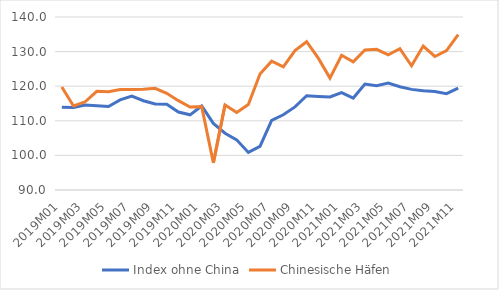
| Category | Index ohne China | Chinesische Häfen |
|---|---|---|
| 2019M01 | 113.937 | 119.767 |
| 2019M02 | 113.812 | 114.273 |
| 2019M03 | 114.535 | 115.492 |
| 2019M04 | 114.346 | 118.515 |
| 2019M05 | 114.139 | 118.384 |
| 2019M06 | 116.043 | 119.064 |
| 2019M07 | 117.144 | 119.017 |
| 2019M08 | 115.792 | 119.137 |
| 2019M09 | 114.853 | 119.391 |
| 2019M10 | 114.79 | 117.939 |
| 2019M11 | 112.522 | 115.82 |
| 2019M12 | 111.727 | 113.96 |
| 2020M01 | 114.273 | 114.092 |
| 2020M02 | 109.246 | 97.829 |
| 2020M03 | 106.401 | 114.569 |
| 2020M04 | 104.496 | 112.385 |
| 2020M05 | 100.853 | 114.71 |
| 2020M06 | 102.626 | 123.532 |
| 2020M07 | 110.124 | 127.228 |
| 2020M08 | 111.753 | 125.582 |
| 2020M09 | 114.006 | 130.304 |
| 2020M10 | 117.235 | 132.851 |
| 2020M11 | 117.052 | 128.105 |
| 2020M12 | 116.906 | 122.333 |
| 2021M01 | 118.147 | 128.931 |
| 2021M02 | 116.58 | 127.061 |
| 2021M03 | 120.599 | 130.467 |
| 2021M04 | 120.152 | 130.662 |
| 2021M05 | 120.888 | 129.041 |
| 2021M06 | 119.833 | 130.856 |
| 2021M07 | 119.078 | 125.892 |
| 2021M08 | 118.707 | 131.602 |
| 2021M09 | 118.467 | 128.587 |
| 2021M10 | 117.828 | 130.291 |
| 2021M11 | 119.458 | 134.937 |